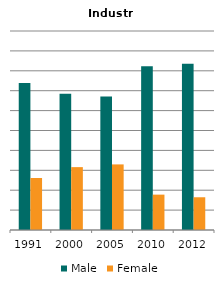
| Category | Male | Female |
|---|---|---|
| 1991.0 | 0.739 | 0.261 |
| 2000.0 | 0.684 | 0.316 |
| 2005.0 | 0.67 | 0.33 |
| 2010.0 | 0.822 | 0.178 |
| 2012.0 | 0.835 | 0.165 |